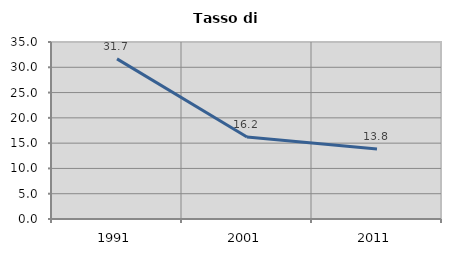
| Category | Tasso di disoccupazione   |
|---|---|
| 1991.0 | 31.662 |
| 2001.0 | 16.232 |
| 2011.0 | 13.846 |